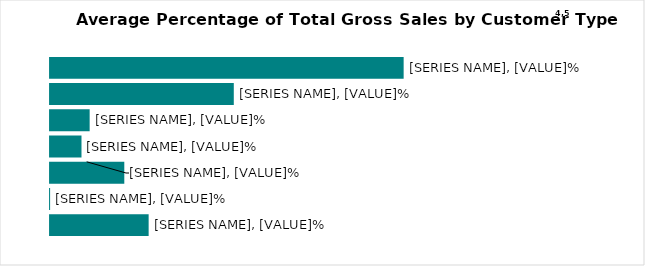
| Category | Direct to Consumer | Restaurants & Caterers | Retailers | Distributors & Other Hubs | Institutions | Processors | Other |
|---|---|---|---|---|---|---|---|
| Total | 45.259 | 23.517 | 5.067 | 4.022 | 9.502 | 0.005 | 12.618 |